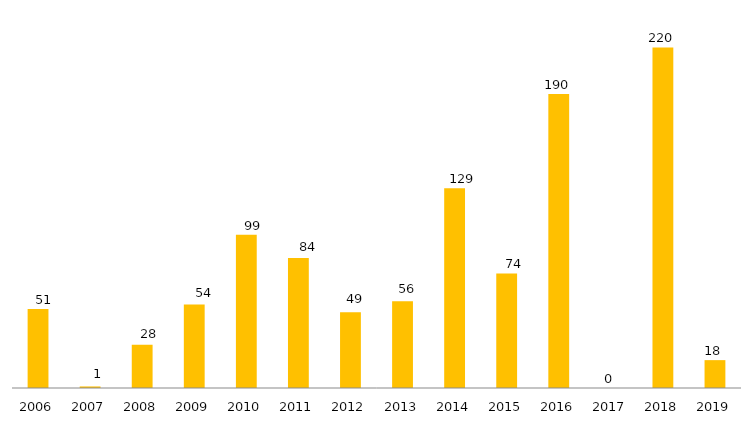
| Category | Especialização |
|---|---|
| 2006.0 | 51 |
| 2007.0 | 1 |
| 2008.0 | 28 |
| 2009.0 | 54 |
| 2010.0 | 99 |
| 2011.0 | 84 |
| 2012.0 | 49 |
| 2013.0 | 56 |
| 2014.0 | 129 |
| 2015.0 | 74 |
| 2016.0 | 190 |
| 2017.0 | 0 |
| 2018.0 | 220 |
| 2019.0 | 18 |